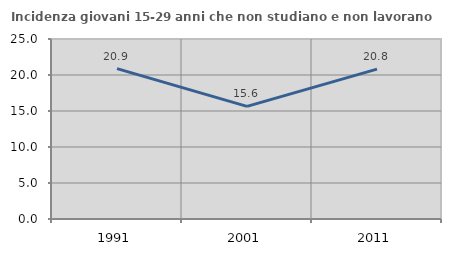
| Category | Incidenza giovani 15-29 anni che non studiano e non lavorano  |
|---|---|
| 1991.0 | 20.879 |
| 2001.0 | 15.642 |
| 2011.0 | 20.809 |